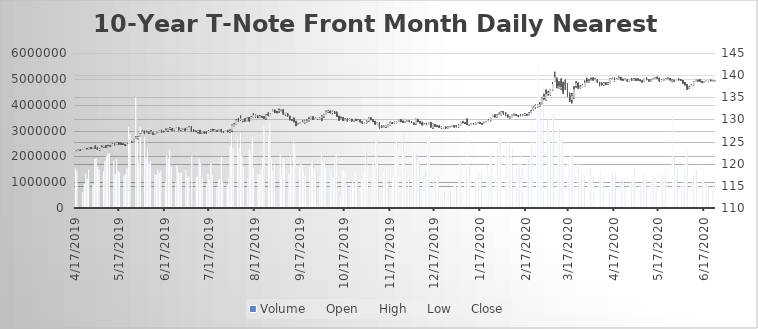
| Category | Volume |
|---|---|
| 4/17/19 | 1521927 |
| 4/18/19 | 1434418 |
| 4/22/19 | 610997 |
| 4/23/19 | 942906 |
| 4/24/19 | 1330691 |
| 4/25/19 | 1141463 |
| 4/26/19 | 1492354 |
| 4/29/19 | 918956 |
| 4/30/19 | 1897188 |
| 5/1/19 | 1929299 |
| 5/2/19 | 1605845 |
| 5/3/19 | 1488964 |
| 5/6/19 | 1421616 |
| 5/7/19 | 1816896 |
| 5/8/19 | 2020026 |
| 5/9/19 | 2119854 |
| 5/10/19 | 2112004 |
| 5/13/19 | 1832738 |
| 5/14/19 | 1302395 |
| 5/15/19 | 1905968 |
| 5/16/19 | 1441988 |
| 5/17/19 | 1357736 |
| 5/20/19 | 1263291 |
| 5/21/19 | 1308309 |
| 5/22/19 | 1523116 |
| 5/23/19 | 3130623 |
| 5/24/19 | 2851424 |
| 5/28/19 | 4279844 |
| 5/29/19 | 2769094 |
| 5/30/19 | 1721231 |
| 5/31/19 | 3145704 |
| 6/3/19 | 2748676 |
| 6/4/19 | 1980440 |
| 6/5/19 | 2341353 |
| 6/6/19 | 1712163 |
| 6/7/19 | 1821859 |
| 6/10/19 | 1290528 |
| 6/11/19 | 1277336 |
| 6/12/19 | 1484141 |
| 6/13/19 | 1333587 |
| 6/14/19 | 1447655 |
| 6/17/19 | 994596 |
| 6/18/19 | 2049160 |
| 6/19/19 | 1922272 |
| 6/20/19 | 2238622 |
| 6/21/19 | 1597384 |
| 6/24/19 | 987020 |
| 6/25/19 | 1649628 |
| 6/26/19 | 1372796 |
| 6/27/19 | 1358937 |
| 6/28/19 | 1360265 |
| 7/1/19 | 1480141 |
| 7/2/19 | 1168305 |
| 7/3/19 | 1229180 |
| 7/5/19 | 1994242 |
| 7/8/19 | 1181049 |
| 7/9/19 | 1234559 |
| 7/10/19 | 1896091 |
| 7/11/19 | 1751719 |
| 7/12/19 | 1148508 |
| 7/15/19 | 931067 |
| 7/16/19 | 1322335 |
| 7/17/19 | 1072723 |
| 7/18/19 | 1741787 |
| 7/19/19 | 1260018 |
| 7/22/19 | 816913 |
| 7/23/19 | 1078947 |
| 7/24/19 | 1127865 |
| 7/25/19 | 1985659 |
| 7/26/19 | 1002499 |
| 7/29/19 | 867368 |
| 7/30/19 | 1151527 |
| 7/31/19 | 2403170 |
| 8/1/19 | 3135151 |
| 8/2/19 | 2311855 |
| 8/5/19 | 2625894 |
| 8/6/19 | 2306499 |
| 8/7/19 | 2910174 |
| 8/8/19 | 2059943 |
| 8/9/19 | 1594152 |
| 8/12/19 | 1147618 |
| 8/13/19 | 2232738 |
| 8/14/19 | 2099883 |
| 8/15/19 | 2722396 |
| 8/16/19 | 1549517 |
| 8/19/19 | 1296412 |
| 8/20/19 | 1318349 |
| 8/21/19 | 1479712 |
| 8/22/19 | 1941609 |
| 8/23/19 | 3167656 |
| 8/26/19 | 2771285 |
| 8/27/19 | 3317674 |
| 8/28/19 | 1899649 |
| 8/29/19 | 1469262 |
| 8/30/19 | 1687236 |
| 9/3/19 | 2102628 |
| 9/4/19 | 1308604 |
| 9/5/19 | 1930481 |
| 9/6/19 | 1778948 |
| 9/9/19 | 1331549 |
| 9/10/19 | 2002467 |
| 9/11/19 | 1613505 |
| 9/12/19 | 2603316 |
| 9/13/19 | 2497593 |
| 9/16/19 | 1602081 |
| 9/17/19 | 1701453 |
| 9/18/19 | 1643122 |
| 9/19/19 | 1440535 |
| 9/20/19 | 1238680 |
| 9/23/19 | 1513971 |
| 9/24/19 | 1689336 |
| 9/25/19 | 1777604 |
| 9/26/19 | 1540564 |
| 9/27/19 | 1325313 |
| 9/30/19 | 1214229 |
| 10/1/19 | 2172846 |
| 10/2/19 | 1824231 |
| 10/3/19 | 1916073 |
| 10/4/19 | 1601440 |
| 10/7/19 | 1084278 |
| 10/8/19 | 1396465 |
| 10/9/19 | 1192798 |
| 10/10/19 | 1907652 |
| 10/11/19 | 2087451 |
| 10/14/19 | 451647 |
| 10/15/19 | 1439696 |
| 10/16/19 | 1480517 |
| 10/17/19 | 1463817 |
| 10/18/19 | 894043 |
| 10/21/19 | 926760 |
| 10/22/19 | 1025951 |
| 10/23/19 | 887398 |
| 10/24/19 | 1318699 |
| 10/25/19 | 1248579 |
| 10/28/19 | 1104455 |
| 10/29/19 | 1107499 |
| 10/30/19 | 1410254 |
| 10/31/19 | 2201732 |
| 11/1/19 | 1624270 |
| 11/4/19 | 1107605 |
| 11/5/19 | 1794964 |
| 11/6/19 | 1484890 |
| 11/7/19 | 2622358 |
| 11/8/19 | 1764060 |
| 11/11/19 | 344598 |
| 11/12/19 | 1365009 |
| 11/13/19 | 1483757 |
| 11/14/19 | 1644581 |
| 11/15/19 | 978639 |
| 11/18/19 | 1198151 |
| 11/19/19 | 1255752 |
| 11/20/19 | 2142632 |
| 11/21/19 | 2582282 |
| 11/22/19 | 2350148 |
| 11/25/19 | 2878708 |
| 11/26/19 | 2172143 |
| 11/27/19 | 1380749 |
| 11/29/19 | 1287212 |
| 12/2/19 | 2091583 |
| 12/3/19 | 2377087 |
| 12/4/19 | 2074650 |
| 12/5/19 | 1696136 |
| 12/6/19 | 1795313 |
| 12/9/19 | 1085164 |
| 12/10/19 | 1412938 |
| 12/11/19 | 1196002 |
| 12/12/19 | 2587611 |
| 12/13/19 | 2715224 |
| 12/16/19 | 1148417 |
| 12/17/19 | 859548 |
| 12/18/19 | 1212185 |
| 12/19/19 | 1205409 |
| 12/20/19 | 806749 |
| 12/23/19 | 620132 |
| 12/24/19 | 398672 |
| 12/26/19 | 402206 |
| 12/27/19 | 667285 |
| 12/30/19 | 891503 |
| 12/31/19 | 850930 |
| 1/2/20 | 1250468 |
| 1/3/20 | 1817748 |
| 1/6/20 | 1666524 |
| 1/7/20 | 1450885 |
| 1/8/20 | 2993268 |
| 1/9/20 | 1594105 |
| 1/10/20 | 1369615 |
| 1/13/20 | 1055289 |
| 1/14/20 | 1421799 |
| 1/15/20 | 1349774 |
| 1/16/20 | 1373300 |
| 1/17/20 | 1390519 |
| 1/21/20 | 1664597 |
| 1/22/20 | 1349211 |
| 1/23/20 | 1938652 |
| 1/24/20 | 2201734 |
| 1/27/20 | 2434005 |
| 1/28/20 | 2306819 |
| 1/29/20 | 1757332 |
| 1/30/20 | 2694207 |
| 1/31/20 | 2664632 |
| 2/3/20 | 2331880 |
| 2/4/20 | 2200574 |
| 2/5/20 | 2584163 |
| 2/6/20 | 1858725 |
| 2/7/20 | 2331670 |
| 2/10/20 | 1689593 |
| 2/11/20 | 1579786 |
| 2/12/20 | 1700284 |
| 2/13/20 | 2149666 |
| 2/14/20 | 1496111 |
| 2/18/20 | 1883347 |
| 2/19/20 | 1663072 |
| 2/20/20 | 2356919 |
| 2/21/20 | 3397725 |
| 2/24/20 | 4232656 |
| 2/25/20 | 5598034 |
| 2/26/20 | 4313431 |
| 2/27/20 | 3301810 |
| 2/28/20 | 4659507 |
| 3/2/20 | 3398686 |
| 3/3/20 | 3872679 |
| 3/4/20 | 2735138 |
| 3/5/20 | 2438978 |
| 3/6/20 | 3639991 |
| 3/9/20 | 3146032 |
| 3/10/20 | 3051818 |
| 3/11/20 | 2719666 |
| 3/12/20 | 2616395 |
| 3/13/20 | 2297625 |
| 3/16/20 | 1911153 |
| 3/17/20 | 1821733 |
| 3/18/20 | 2077161 |
| 3/19/20 | 2057363 |
| 3/20/20 | 1686753 |
| 3/23/20 | 1817511 |
| 3/24/20 | 1401549 |
| 3/25/20 | 1308534 |
| 3/26/20 | 1294144 |
| 3/27/20 | 1247294 |
| 3/30/20 | 1259056 |
| 3/31/20 | 1527275 |
| 4/1/20 | 1342210 |
| 4/2/20 | 1185789 |
| 4/3/20 | 924986 |
| 4/6/20 | 950207 |
| 4/7/20 | 1441115 |
| 4/8/20 | 1137637 |
| 4/9/20 | 1195287 |
| 4/13/20 | 596558 |
| 4/14/20 | 1076610 |
| 4/15/20 | 1331091 |
| 4/16/20 | 1139525 |
| 4/17/20 | 1365292 |
| 4/20/20 | 741098 |
| 4/21/20 | 1092690 |
| 4/22/20 | 954669 |
| 4/23/20 | 1105020 |
| 4/24/20 | 757985 |
| 4/27/20 | 881685 |
| 4/28/20 | 989863 |
| 4/29/20 | 1073167 |
| 4/30/20 | 1533122 |
| 5/1/20 | 870887 |
| 5/4/20 | 916799 |
| 5/5/20 | 962282 |
| 5/6/20 | 1272785 |
| 5/7/20 | 1313439 |
| 5/8/20 | 1090304 |
| 5/11/20 | 981624 |
| 5/12/20 | 1228975 |
| 5/13/20 | 1203530 |
| 5/14/20 | 1097438 |
| 5/15/20 | 1039716 |
| 5/18/20 | 1274344 |
| 5/19/20 | 1271689 |
| 5/20/20 | 1199320 |
| 5/21/20 | 1429655 |
| 5/22/20 | 1390072 |
| 5/26/20 | 3549623 |
| 5/27/20 | 1983215 |
| 5/28/20 | 1277073 |
| 5/29/20 | 1560583 |
| 6/1/20 | 909383 |
| 6/2/20 | 832718 |
| 6/3/20 | 1441032 |
| 6/4/20 | 1699672 |
| 6/5/20 | 2211585 |
| 6/8/20 | 950189 |
| 6/9/20 | 1256988 |
| 6/10/20 | 1399954 |
| 6/11/20 | 1466637 |
| 6/12/20 | 1110376 |
| 6/15/20 | 1056998 |
| 6/16/20 | 1553819 |
| 6/17/20 | 974149 |
| 6/18/20 | 866605 |
| 6/19/20 | 862061 |
| 6/22/20 | 733415 |
| 6/23/20 | 957624 |
| 6/24/20 | 512539 |